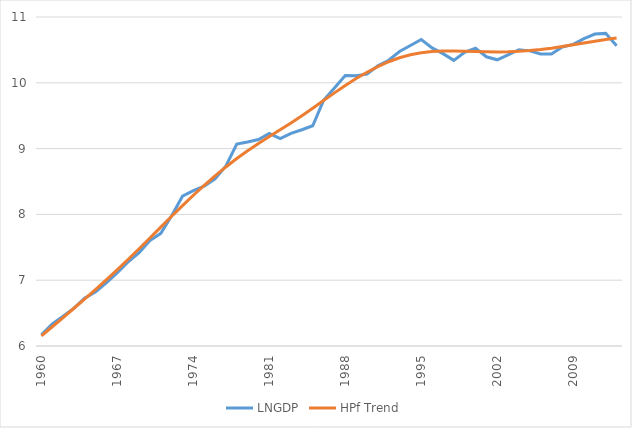
| Category | LNGDP | HPf Trend |
|---|---|---|
| 1960.0 | 6.172 | 6.152 |
| 1961.0 | 6.334 | 6.292 |
| 1962.0 | 6.451 | 6.433 |
| 1963.0 | 6.576 | 6.574 |
| 1964.0 | 6.728 | 6.716 |
| 1965.0 | 6.824 | 6.861 |
| 1966.0 | 6.965 | 7.01 |
| 1967.0 | 7.114 | 7.162 |
| 1968.0 | 7.28 | 7.318 |
| 1969.0 | 7.42 | 7.479 |
| 1970.0 | 7.603 | 7.642 |
| 1971.0 | 7.712 | 7.807 |
| 1972.0 | 7.979 | 7.972 |
| 1973.0 | 8.277 | 8.134 |
| 1974.0 | 8.362 | 8.291 |
| 1975.0 | 8.43 | 8.441 |
| 1976.0 | 8.539 | 8.585 |
| 1977.0 | 8.737 | 8.721 |
| 1978.0 | 9.068 | 8.849 |
| 1979.0 | 9.1 | 8.967 |
| 1980.0 | 9.139 | 9.078 |
| 1981.0 | 9.231 | 9.183 |
| 1982.0 | 9.152 | 9.286 |
| 1983.0 | 9.232 | 9.39 |
| 1984.0 | 9.286 | 9.499 |
| 1985.0 | 9.347 | 9.613 |
| 1986.0 | 9.734 | 9.73 |
| 1987.0 | 9.921 | 9.847 |
| 1988.0 | 10.11 | 9.959 |
| 1989.0 | 10.107 | 10.065 |
| 1990.0 | 10.132 | 10.161 |
| 1991.0 | 10.259 | 10.246 |
| 1992.0 | 10.342 | 10.32 |
| 1993.0 | 10.476 | 10.38 |
| 1994.0 | 10.567 | 10.426 |
| 1995.0 | 10.658 | 10.457 |
| 1996.0 | 10.53 | 10.475 |
| 1997.0 | 10.443 | 10.482 |
| 1998.0 | 10.341 | 10.482 |
| 1999.0 | 10.463 | 10.479 |
| 2000.0 | 10.527 | 10.475 |
| 2001.0 | 10.396 | 10.47 |
| 2002.0 | 10.349 | 10.469 |
| 2003.0 | 10.425 | 10.471 |
| 2004.0 | 10.503 | 10.478 |
| 2005.0 | 10.485 | 10.49 |
| 2006.0 | 10.437 | 10.506 |
| 2007.0 | 10.437 | 10.526 |
| 2008.0 | 10.545 | 10.55 |
| 2009.0 | 10.583 | 10.577 |
| 2010.0 | 10.672 | 10.605 |
| 2011.0 | 10.741 | 10.632 |
| 2012.0 | 10.751 | 10.657 |
| 2013.0 | 10.562 | 10.682 |